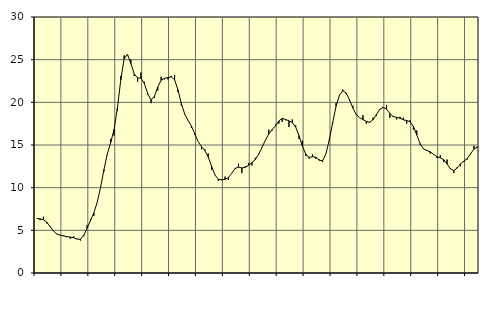
| Category | Piggar | Series 1 |
|---|---|---|
| nan | 6.4 | 6.39 |
| 87.0 | 6.2 | 6.35 |
| 87.0 | 6.6 | 6.24 |
| 87.0 | 5.8 | 5.96 |
| nan | 5.5 | 5.44 |
| 88.0 | 4.9 | 4.91 |
| 88.0 | 4.6 | 4.56 |
| 88.0 | 4.4 | 4.43 |
| nan | 4.4 | 4.35 |
| 89.0 | 4.2 | 4.26 |
| 89.0 | 4 | 4.21 |
| 89.0 | 4.3 | 4.13 |
| nan | 4 | 3.97 |
| 90.0 | 3.8 | 3.96 |
| 90.0 | 4.3 | 4.42 |
| 90.0 | 5.6 | 5.26 |
| nan | 6.3 | 6.15 |
| 91.0 | 6.7 | 7.06 |
| 91.0 | 8.3 | 8.29 |
| 91.0 | 10.1 | 10.04 |
| nan | 11.9 | 12.13 |
| 92.0 | 13.9 | 13.96 |
| 92.0 | 15.7 | 15.3 |
| 92.0 | 16.1 | 16.8 |
| nan | 19 | 19.35 |
| 93.0 | 23.1 | 22.62 |
| 93.0 | 25.5 | 25.1 |
| 93.0 | 25.6 | 25.63 |
| nan | 25 | 24.55 |
| 94.0 | 23.1 | 23.32 |
| 94.0 | 22.4 | 22.87 |
| 94.0 | 23.5 | 22.83 |
| nan | 22.4 | 22.22 |
| 95.0 | 20.9 | 21.02 |
| 95.0 | 19.9 | 20.28 |
| 95.0 | 20.5 | 20.71 |
| nan | 21.4 | 21.8 |
| 96.0 | 23 | 22.6 |
| 96.0 | 22.7 | 22.81 |
| 96.0 | 22.7 | 22.89 |
| nan | 23.1 | 22.99 |
| 97.0 | 23.2 | 22.65 |
| 97.0 | 21.2 | 21.46 |
| 97.0 | 19.6 | 19.87 |
| nan | 18.6 | 18.64 |
| 98.0 | 17.9 | 17.91 |
| 98.0 | 17 | 17.21 |
| 98.0 | 16.2 | 16.34 |
| nan | 15.4 | 15.4 |
| 99.0 | 14.5 | 14.82 |
| 99.0 | 14.5 | 14.35 |
| 99.0 | 14 | 13.59 |
| nan | 12.1 | 12.51 |
| 0.0 | 11.5 | 11.48 |
| 0.0 | 10.8 | 10.98 |
| 0.0 | 11 | 10.91 |
| nan | 11.3 | 10.97 |
| 1.0 | 10.9 | 11.18 |
| 1.0 | 11.7 | 11.69 |
| 1.0 | 12.2 | 12.25 |
| nan | 12.8 | 12.41 |
| 2.0 | 11.7 | 12.31 |
| 2.0 | 12.5 | 12.39 |
| 2.0 | 12.9 | 12.62 |
| nan | 12.6 | 12.92 |
| 3.0 | 13.5 | 13.3 |
| 3.0 | 14 | 13.92 |
| 3.0 | 14.7 | 14.74 |
| nan | 15.6 | 15.56 |
| 4.0 | 16.8 | 16.3 |
| 4.0 | 16.7 | 16.8 |
| 4.0 | 17.4 | 17.25 |
| nan | 17.5 | 17.83 |
| 5.0 | 17.7 | 18.12 |
| 5.0 | 17.9 | 17.99 |
| 5.0 | 17.1 | 17.83 |
| nan | 18 | 17.62 |
| 6.0 | 17.3 | 17.09 |
| 6.0 | 15.7 | 16.09 |
| 6.0 | 15.5 | 14.86 |
| nan | 13.7 | 13.92 |
| 7.0 | 13.4 | 13.55 |
| 7.0 | 13.9 | 13.63 |
| 7.0 | 13.4 | 13.57 |
| nan | 13.3 | 13.21 |
| 8.0 | 13 | 13.16 |
| 8.0 | 14 | 13.98 |
| 8.0 | 15.7 | 15.62 |
| nan | 17.5 | 17.61 |
| 9.0 | 19.9 | 19.53 |
| 9.0 | 20.8 | 20.83 |
| 9.0 | 21.5 | 21.36 |
| nan | 21 | 21.1 |
| 10.0 | 20.2 | 20.3 |
| 10.0 | 19.6 | 19.33 |
| 10.0 | 18.5 | 18.58 |
| nan | 18.2 | 18.19 |
| 11.0 | 18.5 | 17.98 |
| 11.0 | 17.5 | 17.77 |
| 11.0 | 17.6 | 17.66 |
| nan | 18.2 | 17.96 |
| 12.0 | 18.4 | 18.58 |
| 12.0 | 19.1 | 19.16 |
| 12.0 | 19.4 | 19.42 |
| nan | 19.7 | 19.21 |
| 13.0 | 18.2 | 18.69 |
| 13.0 | 18.4 | 18.32 |
| 13.0 | 18 | 18.25 |
| nan | 18.3 | 18.14 |
| 14.0 | 18.2 | 17.95 |
| 14.0 | 17.5 | 17.86 |
| 14.0 | 17.9 | 17.73 |
| nan | 16.8 | 17.18 |
| 15.0 | 16.7 | 16.17 |
| 15.0 | 15 | 15.15 |
| 15.0 | 14.6 | 14.55 |
| nan | 14.3 | 14.36 |
| 16.0 | 14 | 14.21 |
| 16.0 | 13.9 | 13.91 |
| 16.0 | 13.5 | 13.62 |
| nan | 13.8 | 13.49 |
| 17.0 | 13 | 13.29 |
| 17.0 | 13.3 | 12.77 |
| 17.0 | 12.3 | 12.2 |
| nan | 11.7 | 12 |
| 18.0 | 12.4 | 12.3 |
| 18.0 | 12.5 | 12.8 |
| 18.0 | 13 | 13.11 |
| nan | 13.3 | 13.41 |
| 19.0 | 13.9 | 13.97 |
| 19.0 | 14.9 | 14.52 |
| 19.0 | 14.7 | 14.79 |